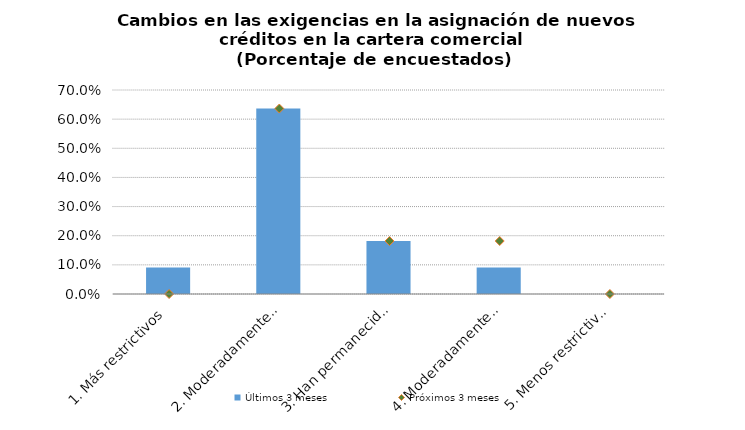
| Category | Últimos 3 meses |
|---|---|
| 1. Más restrictivos | 0.091 |
| 2. Moderadamente más restrictivos | 0.636 |
| 3. Han permanecido igual | 0.182 |
| 4. Moderadamente menos restrictivos | 0.091 |
| 5. Menos restrictivos | 0 |